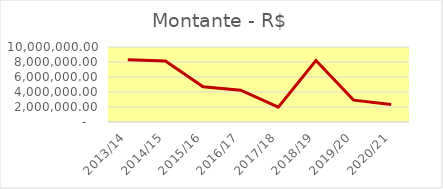
| Category | Montante |
|---|---|
| 2013/14 | 8295383.93 |
| 2014/15 | 8128678.74 |
| 2015/16 | 4695553.55 |
| 2016/17 | 4239752.23 |
| 2017/18 | 1975639.88 |
| 2018/19 | 8192591.64 |
| 2019/20 | 2917711.6 |
| 2020/21 | 2334298.51 |